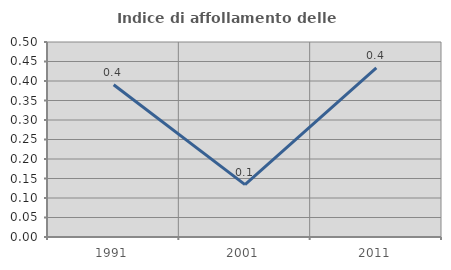
| Category | Indice di affollamento delle abitazioni  |
|---|---|
| 1991.0 | 0.39 |
| 2001.0 | 0.134 |
| 2011.0 | 0.434 |